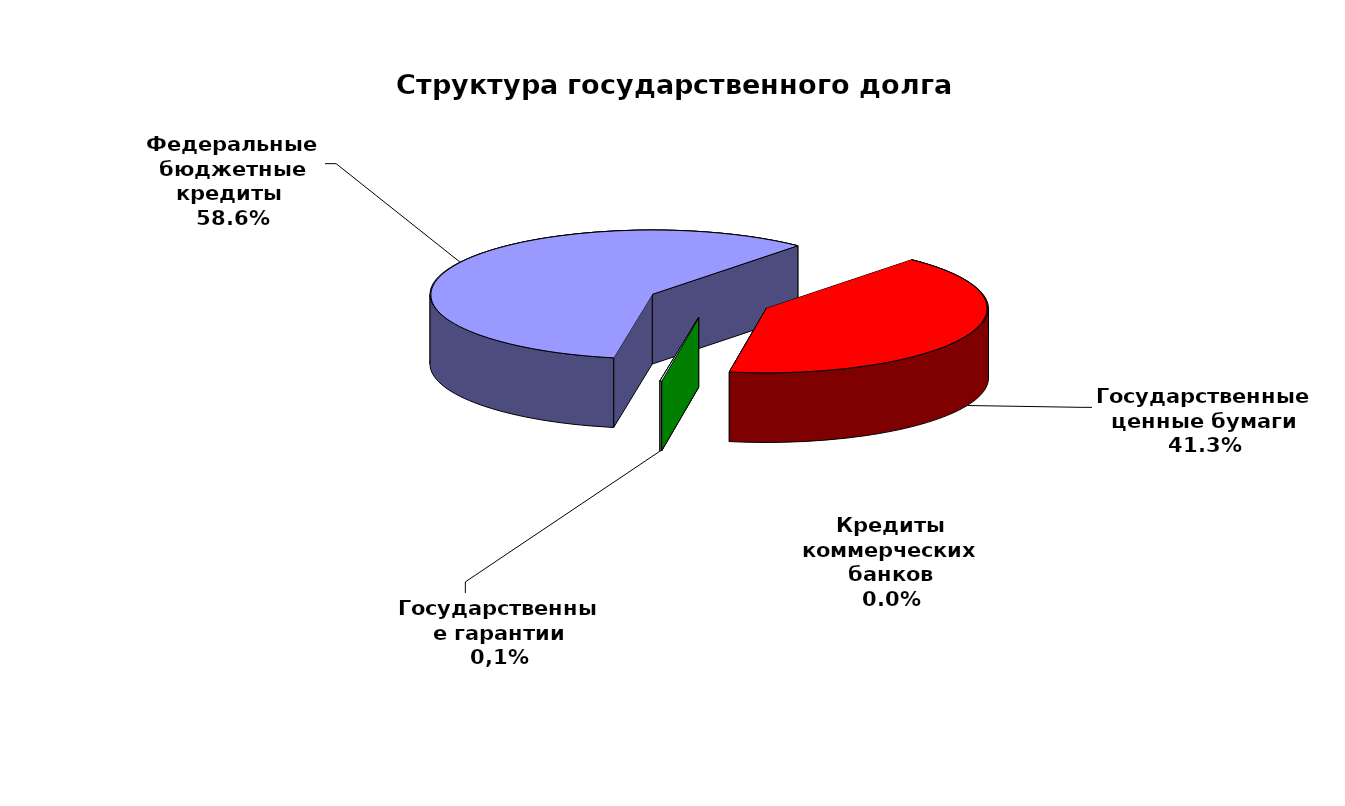
| Category | Series 0 |
|---|---|
| Федеральные бюджетные кредиты  | 65845099.48 |
| Государственные ценные бумаги | 46400000 |
| Кредиты коммерческих банков | 0 |
| Государственные гарантии | 134576.199 |